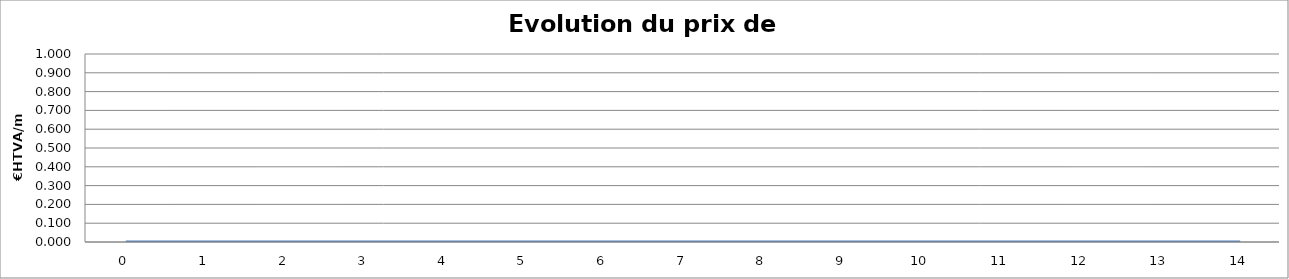
| Category | EAU - €HTVA/m3 |
|---|---|
| 0.0 | 0 |
| 1.0 | 0 |
| 2.0 | 0 |
| 3.0 | 0 |
| 4.0 | 0 |
| 5.0 | 0 |
| 6.0 | 0 |
| 7.0 | 0 |
| 8.0 | 0 |
| 9.0 | 0 |
| 10.0 | 0 |
| 11.0 | 0 |
| 12.0 | 0 |
| 13.0 | 0 |
| 14.0 | 0 |